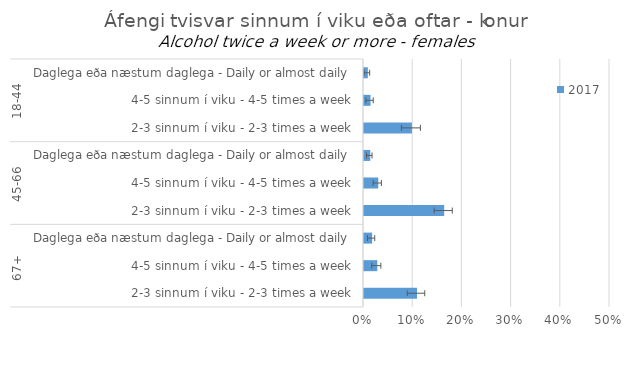
| Category | 2017 |
|---|---|
| 0 | 0.008 |
| 1 | 0.013 |
| 2 | 0.097 |
| 3 | 0.013 |
| 4 | 0.029 |
| 5 | 0.163 |
| 6 | 0.017 |
| 7 | 0.027 |
| 8 | 0.108 |